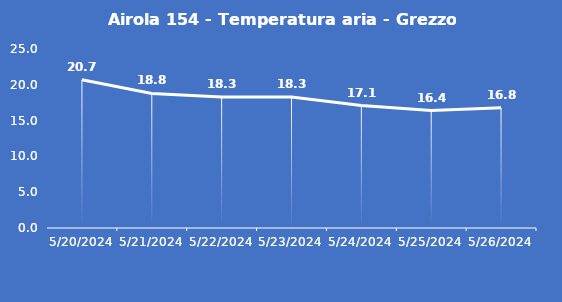
| Category | Airola 154 - Temperatura aria - Grezzo (°C) |
|---|---|
| 5/20/24 | 20.7 |
| 5/21/24 | 18.8 |
| 5/22/24 | 18.3 |
| 5/23/24 | 18.3 |
| 5/24/24 | 17.1 |
| 5/25/24 | 16.4 |
| 5/26/24 | 16.8 |